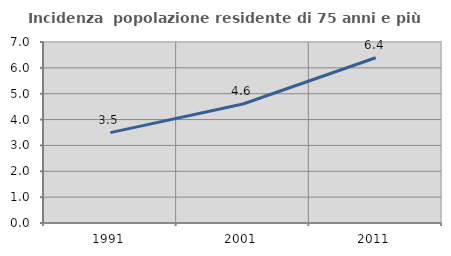
| Category | Incidenza  popolazione residente di 75 anni e più |
|---|---|
| 1991.0 | 3.496 |
| 2001.0 | 4.602 |
| 2011.0 | 6.392 |